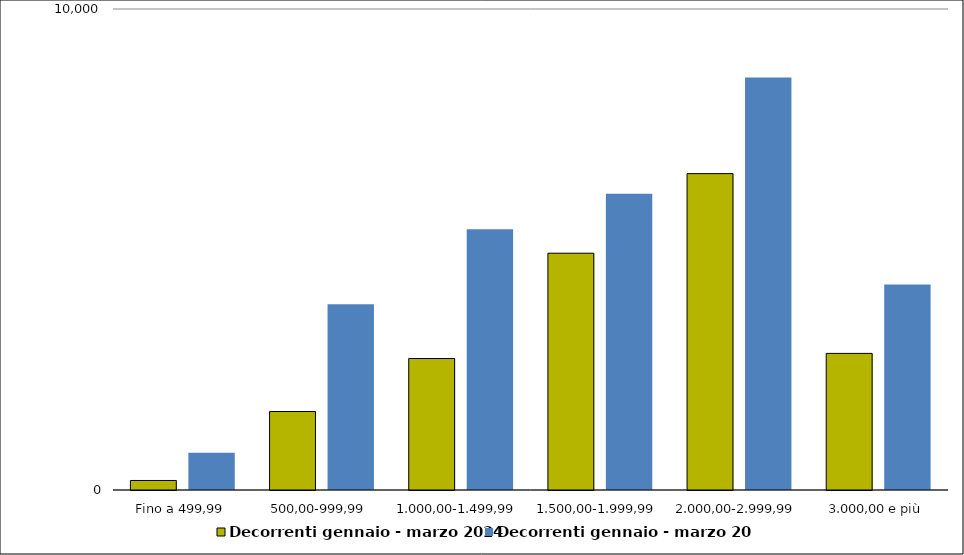
| Category | Decorrenti gennaio - marzo 2024 | Decorrenti gennaio - marzo 2023 |
|---|---|---|
|  Fino a 499,99  | 198 | 773 |
|  500,00-999,99  | 1632 | 3861 |
|  1.000,00-1.499,99  | 2734 | 5421 |
|  1.500,00-1.999,99  | 4923 | 6158 |
|  2.000,00-2.999,99  | 6578 | 8575 |
|  3.000,00 e più  | 2840 | 4271 |